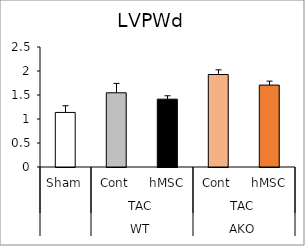
| Category | Series 0 |
|---|---|
| 0 | 1.137 |
| 1 | 1.546 |
| 2 | 1.413 |
| 3 | 1.927 |
| 4 | 1.707 |